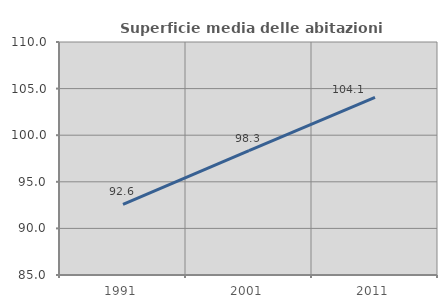
| Category | Superficie media delle abitazioni occupate |
|---|---|
| 1991.0 | 92.566 |
| 2001.0 | 98.345 |
| 2011.0 | 104.058 |